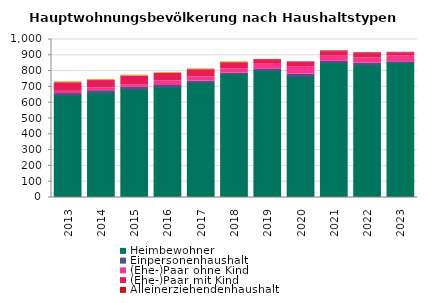
| Category | Heimbewohner | Einpersonenhaushalt | (Ehe-)Paar ohne Kind | (Ehe-)Paar mit Kind | Alleinerziehendenhaushalt | sonstiger Mehrpersonenhaushalt |
|---|---|---|---|---|---|---|
| 2013.0 | 644 | 14 | 14 | 53 | 2 | 5 |
| 2014.0 | 662 | 14 | 17 | 47 | 2 | 5 |
| 2015.0 | 683 | 14 | 17 | 53 | 2 | 5 |
| 2016.0 | 698 | 11 | 29 | 47 | 0 | 5 |
| 2017.0 | 725 | 11 | 26 | 47 | 0 | 5 |
| 2018.0 | 782 | 5 | 26 | 35 | 5 | 5 |
| 2019.0 | 803 | 8 | 32 | 26 | 5 | 0 |
| 2020.0 | 764 | 17 | 47 | 29 | 2 | 0 |
| 2021.0 | 851 | 11 | 32 | 29 | 5 | 0 |
| 2022.0 | 839 | 11 | 32 | 29 | 5 | 0 |
| 2023.0 | 851 | 8 | 38 | 17 | 5 | 0 |